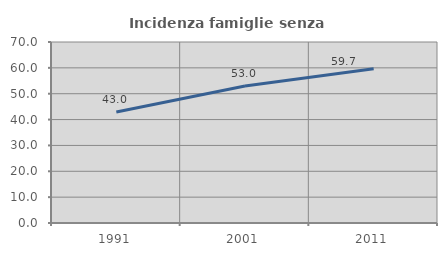
| Category | Incidenza famiglie senza nuclei |
|---|---|
| 1991.0 | 42.96 |
| 2001.0 | 53 |
| 2011.0 | 59.668 |